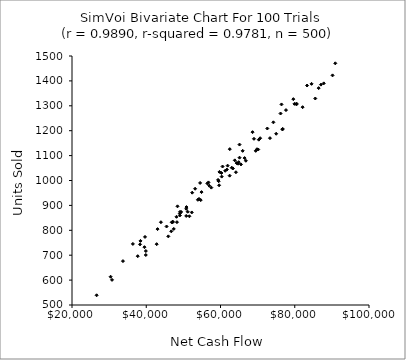
| Category | Series 0 |
|---|---|
| 48154.977217583066 | 854.23 |
| 70682.51596479409 | 1169.861 |
| 86436.5420225312 | 1371.011 |
| 66834.48184401443 | 1079.31 |
| 77634.78412678391 | 1282.814 |
| 61919.69156738762 | 1059.682 |
| 70156.48960359007 | 1124.521 |
| 90184.72702924711 | 1422.244 |
| 47412.03063120171 | 805.429 |
| 47153.82297423416 | 834.728 |
| 70315.16078395753 | 1163.925 |
| 54893.18877706429 | 953.472 |
| 59352.21812398874 | 1002.386 |
| 43958.34105482556 | 832.467 |
| 57531.76421218569 | 971.409 |
| 33721.52515674997 | 676.319 |
| 39877.59826338139 | 700.836 |
| 56752.994389964195 | 992.286 |
| 72608.13298813373 | 1208.853 |
| 38446.16943664757 | 757.344 |
| 60314.1827053593 | 1015.661 |
| 69834.56499417181 | 1125.615 |
| 64337.29943733051 | 1069.892 |
| 47130.56907554706 | 832.478 |
| 38325.85133645695 | 743.458 |
| 54219.642747983875 | 926.007 |
| 48262.903444120406 | 832.652 |
| 63352.32465664006 | 1048.438 |
| 60252.79794104138 | 1030.204 |
| 76166.65208670945 | 1269.046 |
| 76750.59733998531 | 1207.338 |
| 69012.14545992219 | 1167.42 |
| 79919.6168878054 | 1307.757 |
| 62504.38922290401 | 1125.903 |
| 65119.80775418579 | 1144.347 |
| 61264.20784551128 | 1038.957 |
| 30782.138242632733 | 600.88 |
| 51160.15559836281 | 874.603 |
| 43050.6036892064 | 804.831 |
| 39518.391990074204 | 732.243 |
| 54506.8366129497 | 990.234 |
| 49043.35357984937 | 867.098 |
| 90921.8678704726 | 1470.634 |
| 74244.3059296348 | 1233.588 |
| 37711.497301807656 | 696.022 |
| 53905.23708398311 | 922.416 |
| 82120.99361417707 | 1294.505 |
| 65974.25845446187 | 1119.146 |
| 52260.23134478972 | 871.681 |
| 26633.522325595914 | 538.991 |
| 66494.18093266759 | 1090.006 |
| 83312.58172655286 | 1381.438 |
| 59711.91548784729 | 1034.427 |
| 50778.427713971025 | 886.151 |
| 52375.896013475955 | 951.063 |
| 59511.3111831608 | 997.18 |
| 30399.98168625337 | 613.551 |
| 50832.5745551164 | 893.324 |
| 56965.682830189384 | 979.211 |
| 75000.89940822551 | 1187.695 |
| 36397.463767583315 | 745.333 |
| 64164.308127635755 | 1033.237 |
| 53162.49106132139 | 966.919 |
| 76683.56462035289 | 1204.847 |
| 80473.88928697901 | 1308.863 |
| 84532.35526339684 | 1388.137 |
| 46867.55294035408 | 831.999 |
| 39668.01394907492 | 773.353 |
| 69491.07617752672 | 1119.056 |
| 48421.042627684474 | 896.287 |
| 59624.23058747544 | 980.61 |
| 45949.3432467028 | 775.631 |
| 42811.343717013704 | 744.272 |
| 85524.03185049415 | 1329.331 |
| 56458.65201604321 | 988.214 |
| 61718.99473382138 | 1043.899 |
| 45467.77841728845 | 815.304 |
| 64909.654327798096 | 1073.694 |
| 49068.58371308889 | 859.874 |
| 63024.92257023466 | 1051.392 |
| 76433.51148161334 | 1305.487 |
| 51620.01489270308 | 856.355 |
| 39893.69821022398 | 716.742 |
| 62462.52936968756 | 1019.464 |
| 79619.57845908559 | 1326.685 |
| 87814.65117612609 | 1390.113 |
| 54668.48657157927 | 921.232 |
| 65126.774458932865 | 1091.644 |
| 63850.06819411562 | 1080.904 |
| 46750.59939898617 | 795.877 |
| 87060.51842574339 | 1385.003 |
| 80461.87214440771 | 1305.711 |
| 50763.753905041885 | 857.593 |
| 49094.7505282223 | 873.941 |
| 68637.50571250387 | 1194.191 |
| 64732.77941082179 | 1067.496 |
| 73323.76729660372 | 1170.08 |
| 49394.48321932916 | 873.683 |
| 60547.0956469481 | 1056.209 |
| 65516.21868994972 | 1064.546 |